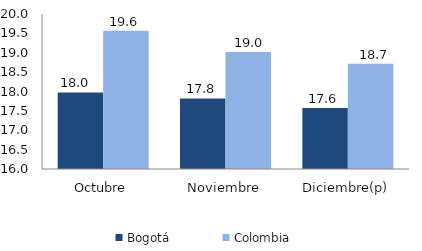
| Category | Bogotá | Colombia |
|---|---|---|
| Octubre | 17.977 | 19.567 |
| Noviembre | 17.819 | 19.017 |
| Diciembre(p) | 17.575 | 18.718 |